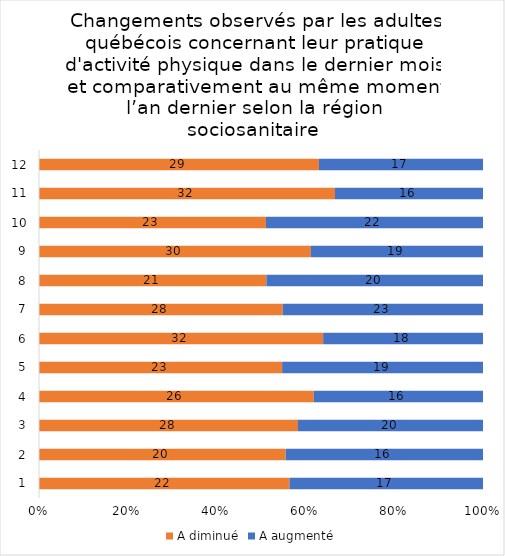
| Category | A diminué | A augmenté |
|---|---|---|
| 0 | 22 | 17 |
| 1 | 20 | 16 |
| 2 | 28 | 20 |
| 3 | 26 | 16 |
| 4 | 23 | 19 |
| 5 | 32 | 18 |
| 6 | 28 | 23 |
| 7 | 21 | 20 |
| 8 | 30 | 19 |
| 9 | 23 | 22 |
| 10 | 32 | 16 |
| 11 | 29 | 17 |